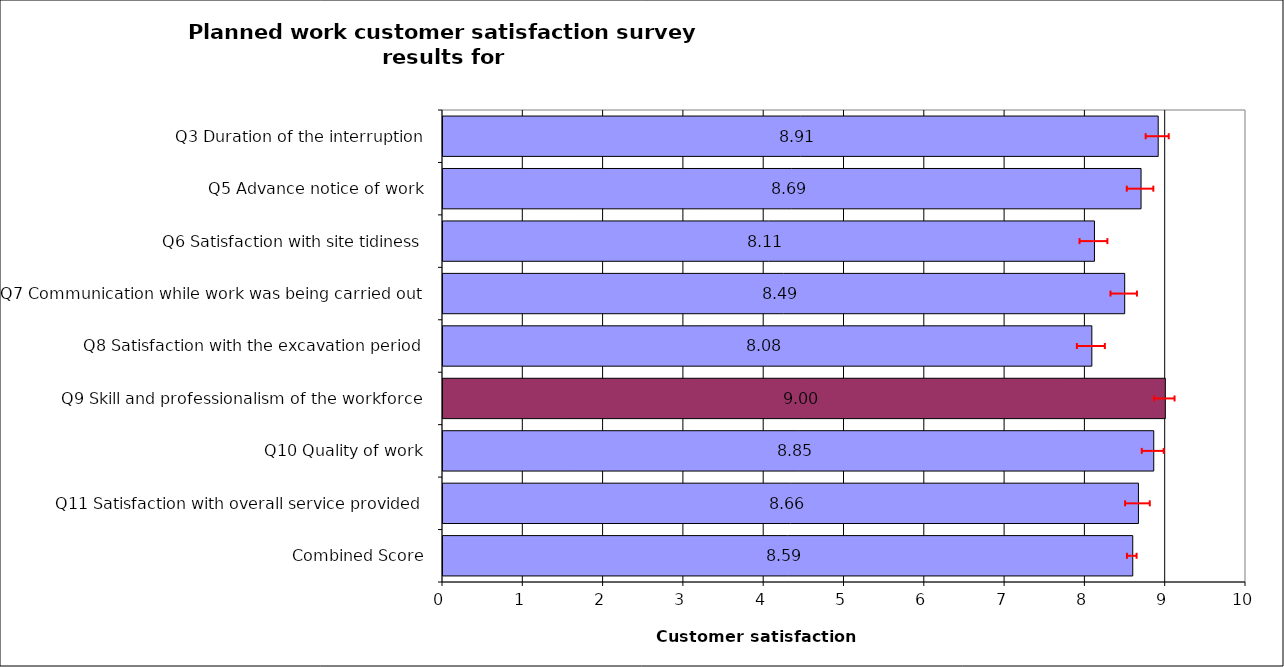
| Category | Series 0 |
|---|---|
| Q3 Duration of the interruption | 8.907 |
| Q5 Advance notice of work | 8.693 |
| Q6 Satisfaction with site tidiness | 8.113 |
| Q7 Communication while work was being carried out | 8.489 |
| Q8 Satisfaction with the excavation period | 8.08 |
| Q9 Skill and professionalism of the workforce | 8.995 |
| Q10 Quality of work | 8.851 |
| Q11 Satisfaction with overall service provided | 8.66 |
| Combined Score | 8.59 |